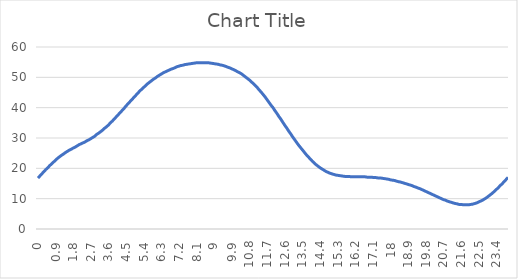
| Category | Series 0 |
|---|---|
| 0.0 | 16.8 |
| 0.1 | 17.5 |
| 0.2 | 18.2 |
| 0.3 | 18.9 |
| 0.4 | 19.6 |
| 0.5 | 20.2 |
| 0.6 | 20.9 |
| 0.7 | 21.5 |
| 0.8 | 22.1 |
| 0.9 | 22.7 |
| 1.0 | 23.3 |
| 1.1 | 23.8 |
| 1.2 | 24.3 |
| 1.3 | 24.7 |
| 1.4 | 25.2 |
| 1.5 | 25.6 |
| 1.6 | 26 |
| 1.7 | 26.3 |
| 1.8 | 26.7 |
| 1.9 | 27 |
| 2.0 | 27.4 |
| 2.1 | 27.8 |
| 2.2 | 28.1 |
| 2.3 | 28.4 |
| 2.4 | 28.7 |
| 2.5 | 29.1 |
| 2.6 | 29.4 |
| 2.7 | 29.8 |
| 2.8 | 30.2 |
| 2.9 | 30.6 |
| 3.0 | 31.2 |
| 3.1 | 31.6 |
| 3.2 | 32.1 |
| 3.3 | 32.6 |
| 3.4 | 33.2 |
| 3.5 | 33.7 |
| 3.6 | 34.3 |
| 3.7 | 35 |
| 3.8 | 35.6 |
| 3.9 | 36.3 |
| 4.0 | 37 |
| 4.1 | 37.7 |
| 4.2 | 38.4 |
| 4.3 | 39.1 |
| 4.4 | 39.8 |
| 4.5 | 40.6 |
| 4.6 | 41.3 |
| 4.7 | 42 |
| 4.8 | 42.7 |
| 4.9 | 43.4 |
| 5.0 | 44.1 |
| 5.1 | 44.8 |
| 5.2 | 45.5 |
| 5.3 | 46.1 |
| 5.4 | 46.7 |
| 5.5 | 47.3 |
| 5.6 | 47.9 |
| 5.7 | 48.4 |
| 5.8 | 48.9 |
| 5.9 | 49.4 |
| 6.0 | 49.8 |
| 6.1 | 50.3 |
| 6.2 | 50.7 |
| 6.3 | 51.1 |
| 6.4 | 51.5 |
| 6.5 | 51.8 |
| 6.6 | 52.1 |
| 6.7 | 52.4 |
| 6.8 | 52.7 |
| 6.9 | 52.9 |
| 7.0 | 53.2 |
| 7.1 | 53.5 |
| 7.2 | 53.7 |
| 7.3 | 53.9 |
| 7.4 | 54 |
| 7.5 | 54.2 |
| 7.6 | 54.3 |
| 7.7 | 54.4 |
| 7.8 | 54.5 |
| 7.9 | 54.6 |
| 8.0 | 54.7 |
| 8.1 | 54.8 |
| 8.2 | 54.8 |
| 8.3 | 54.8 |
| 8.4 | 54.8 |
| 8.5 | 54.8 |
| 8.6 | 54.8 |
| 8.7 | 54.8 |
| 8.8 | 54.7 |
| 8.9 | 54.6 |
| 9.0 | 54.5 |
| 9.1 | 54.4 |
| 9.2 | 54.3 |
| 9.3 | 54.1 |
| 9.4 | 54 |
| 9.5 | 53.8 |
| 9.6 | 53.6 |
| 9.7 | 53.3 |
| 9.8 | 53.1 |
| 9.9 | 52.8 |
| 10.0 | 52.5 |
| 10.1 | 52.2 |
| 10.2 | 51.8 |
| 10.3 | 51.5 |
| 10.4 | 51.1 |
| 10.5 | 50.6 |
| 10.6 | 50.1 |
| 10.7 | 49.6 |
| 10.8 | 49.1 |
| 10.9 | 48.5 |
| 11.0 | 47.9 |
| 11.1 | 47.3 |
| 11.2 | 46.6 |
| 11.3 | 45.8 |
| 11.4 | 45.1 |
| 11.5 | 44.3 |
| 11.6 | 43.5 |
| 11.7 | 42.6 |
| 11.8 | 41.7 |
| 11.9 | 40.8 |
| 12.0 | 40 |
| 12.1 | 39 |
| 12.2 | 38.1 |
| 12.3 | 37.1 |
| 12.4 | 36.2 |
| 12.5 | 35.2 |
| 12.6 | 34.2 |
| 12.7 | 33.3 |
| 12.8 | 32.3 |
| 12.9 | 31.4 |
| 13.0 | 30.4 |
| 13.1 | 29.5 |
| 13.2 | 28.6 |
| 13.3 | 27.7 |
| 13.4 | 26.9 |
| 13.5 | 26.1 |
| 13.6 | 25.3 |
| 13.7 | 24.5 |
| 13.8 | 23.8 |
| 13.9 | 23.1 |
| 14.0 | 22.4 |
| 14.1 | 21.8 |
| 14.2 | 21.2 |
| 14.3 | 20.7 |
| 14.4 | 20.2 |
| 14.5 | 19.8 |
| 14.6 | 19.4 |
| 14.7 | 19 |
| 14.8 | 18.7 |
| 14.9 | 18.4 |
| 15.0 | 18.2 |
| 15.1 | 18 |
| 15.2 | 17.8 |
| 15.3 | 17.7 |
| 15.4 | 17.6 |
| 15.5 | 17.5 |
| 15.6 | 17.4 |
| 15.7 | 17.3 |
| 15.8 | 17.3 |
| 15.9 | 17.3 |
| 16.0 | 17.2 |
| 16.1 | 17.2 |
| 16.2 | 17.2 |
| 16.3 | 17.2 |
| 16.4 | 17.2 |
| 16.5 | 17.2 |
| 16.6 | 17.2 |
| 16.7 | 17.2 |
| 16.8 | 17.1 |
| 16.9 | 17.1 |
| 17.0 | 17.1 |
| 17.1 | 17 |
| 17.2 | 17 |
| 17.3 | 16.9 |
| 17.4 | 16.8 |
| 17.5 | 16.8 |
| 17.6 | 16.7 |
| 17.7 | 16.6 |
| 17.8 | 16.5 |
| 17.9 | 16.4 |
| 18.0 | 16.2 |
| 18.1 | 16.1 |
| 18.2 | 16 |
| 18.3 | 15.8 |
| 18.4 | 15.6 |
| 18.5 | 15.5 |
| 18.6 | 15.3 |
| 18.7 | 15.1 |
| 18.8 | 14.9 |
| 18.9 | 14.7 |
| 19.0 | 14.5 |
| 19.1 | 14.3 |
| 19.2 | 14 |
| 19.3 | 13.8 |
| 19.4 | 13.5 |
| 19.5 | 13.3 |
| 19.6 | 13 |
| 19.7 | 12.7 |
| 19.8 | 12.4 |
| 19.9 | 12.1 |
| 20.0 | 11.8 |
| 20.1 | 11.5 |
| 20.2 | 11.2 |
| 20.3 | 10.9 |
| 20.4 | 10.6 |
| 20.5 | 10.3 |
| 20.6 | 10 |
| 20.7 | 9.7 |
| 20.8 | 9.5 |
| 20.9 | 9.2 |
| 21.0 | 9 |
| 21.1 | 8.8 |
| 21.2 | 8.6 |
| 21.3 | 8.4 |
| 21.4 | 8.3 |
| 21.5 | 8.1 |
| 21.6 | 8.1 |
| 21.7 | 8 |
| 21.8 | 8 |
| 21.9 | 8 |
| 22.0 | 8 |
| 22.1 | 8.1 |
| 22.2 | 8.2 |
| 22.3 | 8.4 |
| 22.4 | 8.6 |
| 22.5 | 8.9 |
| 22.6 | 9.2 |
| 22.7 | 9.5 |
| 22.8 | 9.9 |
| 22.9 | 10.3 |
| 23.0 | 10.8 |
| 23.1 | 11.3 |
| 23.2 | 11.8 |
| 23.3 | 12.4 |
| 23.4 | 13 |
| 23.5 | 13.6 |
| 23.6 | 14.3 |
| 23.7 | 14.9 |
| 23.8 | 15.6 |
| 23.9 | 16.3 |
| 24.0 | 17 |